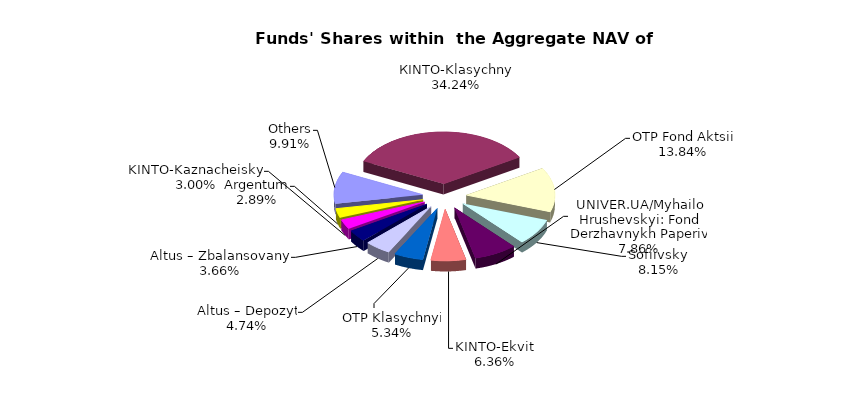
| Category | Series 0 | Series 1 |
|---|---|---|
| Others | 8179096.31 | 0.099 |
| КІNТО-Klasychnyi | 28252927.54 | 0.342 |
| ОТP Fond Aktsii | 11420140.49 | 0.138 |
| Sofiivskyi | 6723575.95 | 0.081 |
| UNIVER.UA/Myhailo Hrushevskyi: Fond Derzhavnykh Paperiv | 6485824.62 | 0.079 |
| KINTO-Ekviti | 5250634.16 | 0.064 |
| ОТP Klasychnyi | 4402921.53 | 0.053 |
| Altus – Depozyt | 3912601.58 | 0.047 |
| Altus – Zbalansovanyi | 3021335.92 | 0.037 |
| KINTO-Kaznacheiskyi | 2474062.63 | 0.03 |
| Аrgentum | 2388552.37 | 0.029 |